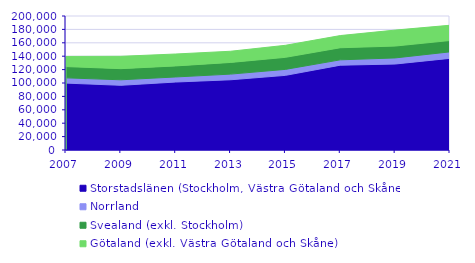
| Category | Storstadslänen (Stockholm, Västra Götaland och Skåne) | Norrland | Svealand (exkl. Stockholm) | Götaland (exkl. Västra Götaland och Skåne) |
|---|---|---|---|---|
| 2007.0 | 99837 | 7839 | 16834 | 15100 |
| 2009.0 | 96566 | 8196 | 16647 | 18404 |
| 2011.0 | 101457 | 7556 | 16485 | 17773 |
| 2013.0 | 104821 | 8428 | 17439 | 16696 |
| 2015.0 | 111396 | 8926 | 17978 | 17972 |
| 2017.0 | 126591 | 7980 | 18045 | 18173 |
| 2019.0 | 128326 | 9082 | 17723 | 23814 |
| 2021.0 | 136831 | 9657 | 16938 | 22764 |